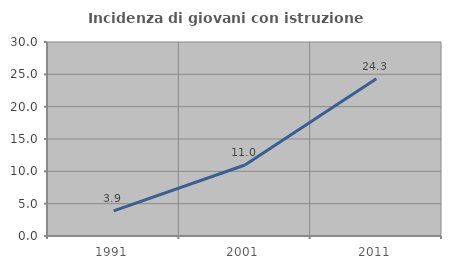
| Category | Incidenza di giovani con istruzione universitaria |
|---|---|
| 1991.0 | 3.887 |
| 2001.0 | 10.978 |
| 2011.0 | 24.304 |